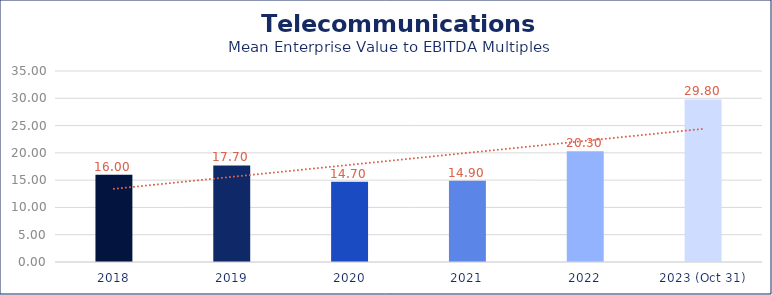
| Category | Telecommunications |
|---|---|
| 2018 | 16 |
| 2019 | 17.7 |
| 2020 | 14.7 |
| 2021 | 14.9 |
| 2022 | 20.3 |
| 2023 (Oct 31) | 29.8 |